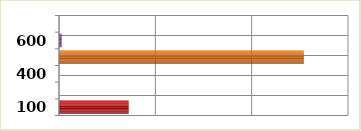
| Category | Series 0 |
|---|---|
| 100.0 | 14466788 |
| 200.0 | 0 |
| 400.0 | 0 |
| 500.0 | 50835599 |
| 600.0 | 551607 |
| 700.0 | 0 |